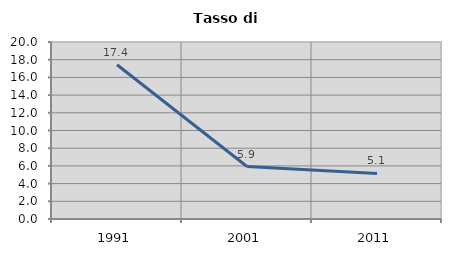
| Category | Tasso di disoccupazione   |
|---|---|
| 1991.0 | 17.424 |
| 2001.0 | 5.926 |
| 2011.0 | 5.147 |